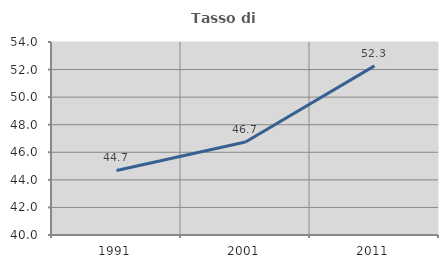
| Category | Tasso di occupazione   |
|---|---|
| 1991.0 | 44.683 |
| 2001.0 | 46.744 |
| 2011.0 | 52.269 |